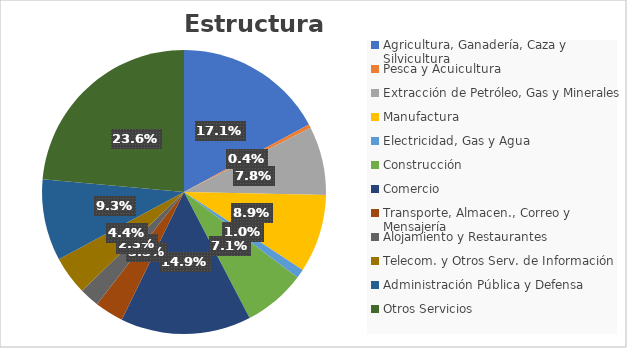
| Category | Series 0 |
|---|---|
| Agricultura, Ganadería, Caza y Silvicultura | 3918959 |
| Pesca y Acuicultura | 91045 |
| Extracción de Petróleo, Gas y Minerales | 1791456 |
| Manufactura | 2038268 |
| Electricidad, Gas y Agua | 235669 |
| Construcción | 1622366 |
| Comercio | 3403585 |
| Transporte, Almacen., Correo y Mensajería | 750012 |
| Alojamiento y Restaurantes | 517108 |
| Telecom. y Otros Serv. de Información | 1008649 |
| Administración Pública y Defensa | 2124587 |
| Otros Servicios | 5394564 |